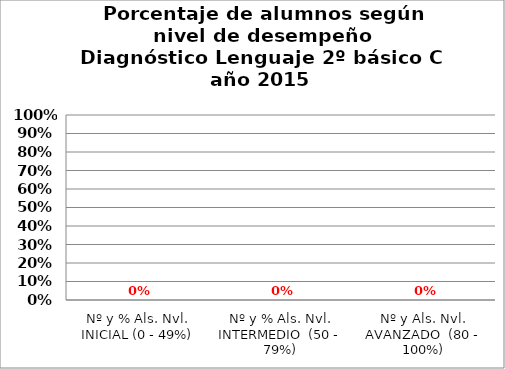
| Category | Series 0 |
|---|---|
| Nº y % Als. Nvl. INICIAL (0 - 49%) | 0 |
| Nº y % Als. Nvl. INTERMEDIO  (50 - 79%) | 0 |
| Nº y Als. Nvl. AVANZADO  (80 - 100%) | 0 |